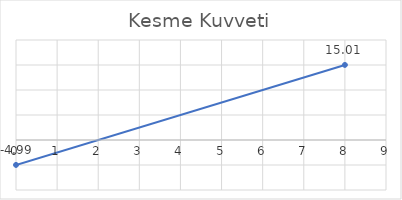
| Category | Series 0 |
|---|---|
| 0.0 | -4.985 |
| 8.0 | 15.015 |